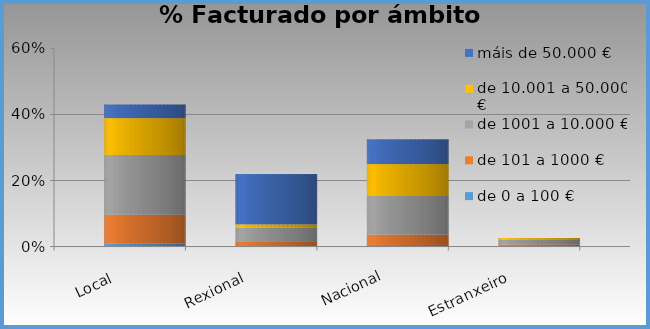
| Category | de 0 a 100 € | de 101 a 1000 € | de 1001 a 10.000 € | de 10.001 a 50.000 € | máis de 50.000 € |
|---|---|---|---|---|---|
| Local | 0.009 | 0.087 | 0.181 | 0.112 | 0.041 |
| Rexional | 0.001 | 0.013 | 0.043 | 0.01 | 0.152 |
| Nacional | 0.005 | 0.031 | 0.117 | 0.097 | 0.075 |
| Estranxeiro | 0 | 0.006 | 0.014 | 0.006 | 0 |